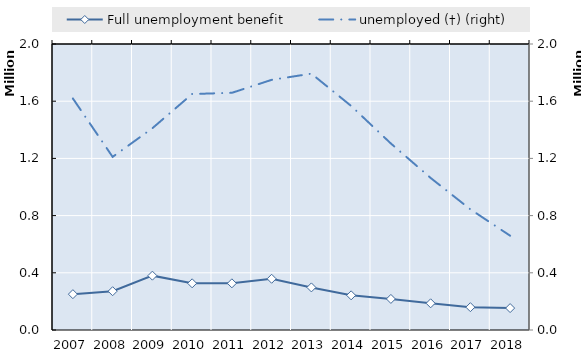
| Category | Series 6 | Series 7 | Series 8 | Series 9 | Series 10 | Series 11 | Series 12 | Series 13 | Series 14 | Series 15 | Series 16 | Series 17 | Series 18 | Series 19 | Full unemployment benefit |
|---|---|---|---|---|---|---|---|---|---|---|---|---|---|---|---|
| 2007.0 |  |  |  |  |  |  |  |  |  |  |  |  |  |  | 250633 |
| 2008.0 |  |  |  |  |  |  |  |  |  |  |  |  |  |  | 271269 |
| 2009.0 |  |  |  |  |  |  |  |  |  |  |  |  |  |  | 380007 |
| 2010.0 |  |  |  |  |  |  |  |  |  |  |  |  |  |  | 326582 |
| 2011.0 |  |  |  |  |  |  |  |  |  |  |  |  |  |  | 326471 |
| 2012.0 |  |  |  |  |  |  |  |  |  |  |  |  |  |  | 358250 |
| 2013.0 |  |  |  |  |  |  |  |  |  |  |  |  |  |  | 297778 |
| 2014.0 |  |  |  |  |  |  |  |  |  |  |  |  |  |  | 242378 |
| 2015.0 |  |  |  |  |  |  |  |  |  |  |  |  |  |  | 217315 |
| 2016.0 |  |  |  |  |  |  |  |  |  |  |  |  |  |  | 186700 |
| 2017.0 |  |  |  |  |  |  |  |  |  |  |  |  |  |  | 159583 |
| 2018.0 |  |  |  |  |  |  |  |  |  |  |  |  |  |  | 153268 |